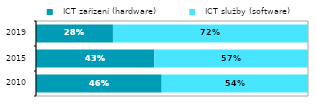
| Category |   ICT zařízení (hardware) |   ICT služby (software) |
|---|---|---|
| 2010.0 | 0.462 | 0.538 |
| 2015.0 | 0.435 | 0.565 |
| 2019.0 | 0.283 | 0.717 |